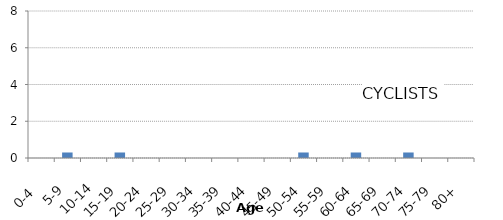
| Category | CYCLISTS |
|---|---|
| 0-4  | 0 |
| 5-9 | 0.3 |
| 10-14 | 0 |
| 15-19  | 0.3 |
| 20-24  | 0 |
| 25-29  | 0 |
| 30-34  | 0 |
| 35-39  | 0 |
| 40-44  | 0 |
| 45-49  | 0 |
| 50-54  | 0.3 |
| 55-59  | 0 |
| 60-64  | 0.3 |
| 65-69  | 0 |
| 70-74  | 0.3 |
| 75-79  | 0 |
| 80+ | 0 |